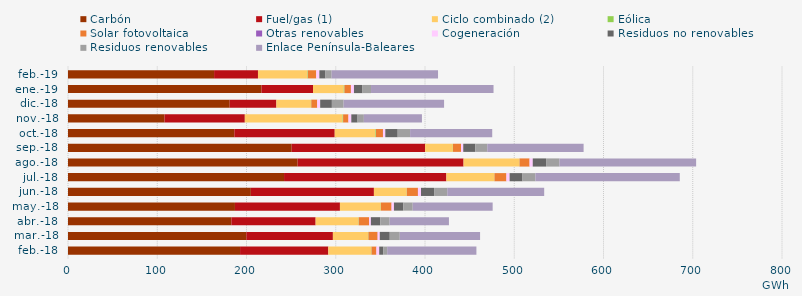
| Category | Carbón | Fuel/gas (1) | Ciclo combinado (2) | Eólica | Solar fotovoltaica | Otras renovables | Cogeneración | Residuos no renovables | Residuos renovables | Enlace Península-Baleares |
|---|---|---|---|---|---|---|---|---|---|---|
| feb.-18 | 192.795 | 98.852 | 48.135 | 0.324 | 5.338 | 0.166 | 3.084 | 4.456 | 4.456 | 99.993 |
| mar.-18 | 199.822 | 96.98 | 39.439 | 0.406 | 10.194 | 0.184 | 2.295 | 11.2 | 11.2 | 89.997 |
| abr.-18 | 183.056 | 94.399 | 48.047 | 0.283 | 11.478 | 0.131 | 1.982 | 10.487 | 10.487 | 66.468 |
| may.-18 | 187.059 | 117.635 | 45.725 | 0.229 | 11.839 | 0.128 | 2.579 | 10.525 | 10.525 | 89.565 |
| jun.-18 | 204.88 | 137.881 | 36.755 | 0.139 | 12.383 | 0.11 | 3.357 | 14.709 | 14.709 | 108.624 |
| jul.-18 | 242.068 | 181.893 | 53.755 | 0.139 | 13.342 | 0.058 | 3.566 | 14.429 | 14.429 | 161.792 |
| ago.-18 | 257.313 | 185.888 | 62.511 | 0.192 | 11.251 | 0.057 | 3.515 | 14.961 | 14.961 | 153.134 |
| sep.-18 | 250.63 | 149.447 | 31.105 | 0.198 | 9.026 | 0.019 | 2.437 | 13.454 | 13.454 | 107.931 |
| oct.-18 | 186.346 | 112.508 | 45.569 | 0.62 | 7.841 | 0.06 | 2.572 | 13.898 | 13.898 | 92.008 |
| nov.-18 | 108.147 | 89.969 | 109.561 | 0.555 | 5.979 | 0.069 | 3.146 | 7.033 | 7.033 | 65.068 |
| dic.-18 | 181.178 | 52.297 | 38.728 | 0.419 | 6.536 | 0.131 | 3.26 | 13.125 | 13.125 | 112.575 |
| ene.-19 | 216.788 | 57.737 | 34.412 | 0.805 | 7.21 | 0.108 | 3.342 | 9.561 | 9.561 | 137.255 |
| feb.-19 | 163.684 | 49.178 | 55.402 | 0.499 | 9.319 | 0.082 | 3.484 | 6.86 | 6.86 | 119.224 |